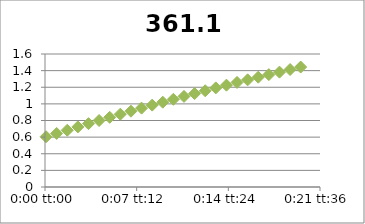
| Category | 361.1 |
|---|---|
| 5.78703703703704e-05 | 0.604 |
| 0.000636574074074074 | 0.644 |
| 0.00121527777777778 | 0.683 |
| 0.00179398148148148 | 0.723 |
| 0.00237268518518518 | 0.762 |
| 0.00295138888888889 | 0.8 |
| 0.00353009259259259 | 0.838 |
| 0.0041087962962963 | 0.876 |
| 0.0046875 | 0.912 |
| 0.0052662037037037 | 0.949 |
| 0.00584490740740741 | 0.985 |
| 0.00642361111111111 | 1.02 |
| 0.00700231481481481 | 1.055 |
| 0.00758101851851852 | 1.09 |
| 0.00815972222222222 | 1.124 |
| 0.00873842592592592 | 1.158 |
| 0.00931712962962963 | 1.192 |
| 0.00989583333333333 | 1.225 |
| 0.010474537037037 | 1.258 |
| 0.0110532407407407 | 1.289 |
| 0.0116319444444444 | 1.321 |
| 0.0122106481481481 | 1.352 |
| 0.0127893518518518 | 1.382 |
| 0.0133680555555556 | 1.413 |
| 0.0139467592592593 | 1.443 |